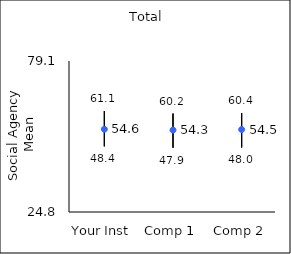
| Category | 25th percentile | 75th percentile | Mean |
|---|---|---|---|
| Your Inst | 48.4 | 61.1 | 54.56 |
| Comp 1 | 47.9 | 60.2 | 54.27 |
| Comp 2 | 48 | 60.4 | 54.46 |